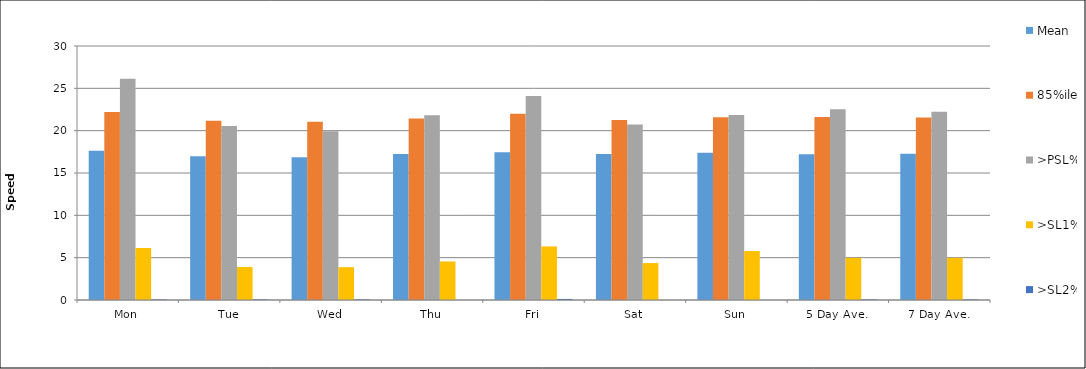
| Category | Mean | 85%ile | >PSL% | >SL1% | >SL2% |
|---|---|---|---|---|---|
| Mon | 17.622 | 22.205 | 26.13 | 6.156 | 0.065 |
| Tue | 16.97 | 21.168 | 20.56 | 3.893 | 0.068 |
| Wed | 16.869 | 21.068 | 19.946 | 3.88 | 0.068 |
| Thu | 17.25 | 21.447 | 21.833 | 4.551 | 0 |
| Fri | 17.462 | 22.005 | 24.08 | 6.327 | 0.129 |
| Sat | 17.255 | 21.263 | 20.738 | 4.362 | 0 |
| Sun | 17.398 | 21.588 | 21.842 | 5.789 | 0 |
| 5 Day Ave. | 17.2 | 21.615 | 22.528 | 4.977 | 0.065 |
| 7 Day Ave. | 17.26 | 21.553 | 22.237 | 4.98 | 0.068 |